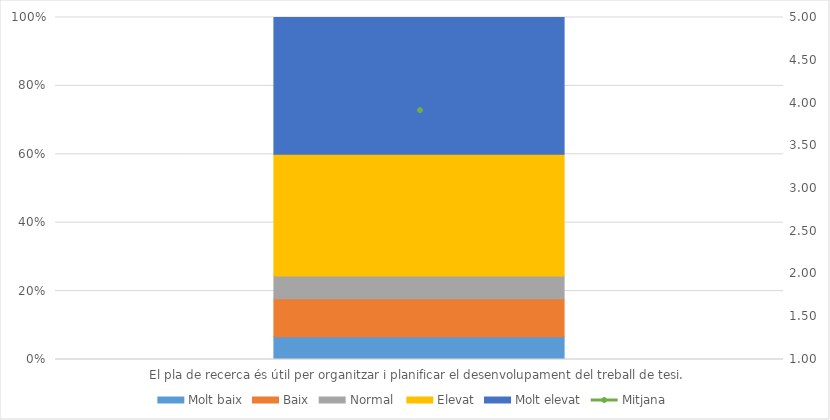
| Category | Molt baix | Baix | Normal  | Elevat | Molt elevat |
|---|---|---|---|---|---|
| El pla de recerca és útil per organitzar i planificar el desenvolupament del treball de tesi. | 3 | 5 | 3 | 16 | 18 |